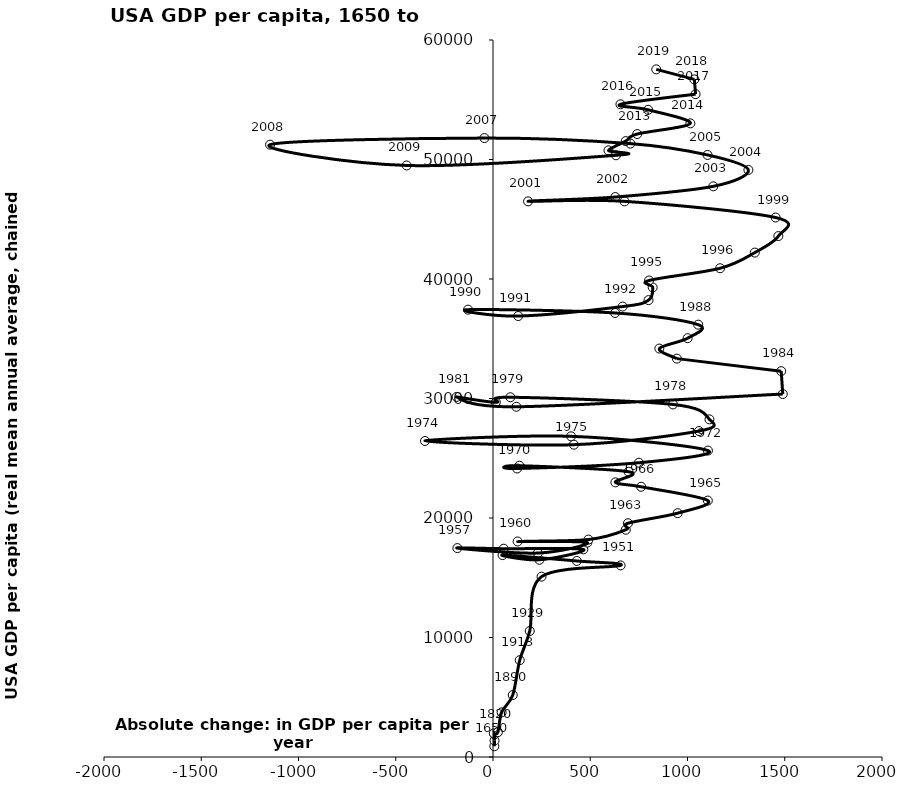
| Category | Series 0 |
|---|---|
| 6.828571428571428 | 897 |
| 7.888 | 1375 |
| 7.5625 | 1883 |
| 4.377777777777778 | 1980 |
| 25.085714285714285 | 2080 |
| 44.34285714285714 | 3736 |
| 101.51162790697674 | 5184 |
| 137.4102564102564 | 8101 |
| 188.9527027027027 | 10543 |
| 249.5340909090909 | 15092.25 |
| 656.125 | 16032.75 |
| 430.75 | 16404.5 |
| 49.25 | 16894.25 |
| 238.5 | 16503 |
| 464.375 | 17371.25 |
| 55.25 | 17431.75 |
| -183.25 | 17481.75 |
| 230.375 | 17065.25 |
| 485.25 | 17942.5 |
| 126.5 | 18035.75 |
| 490.5 | 18195.5 |
| 682.5 | 19016.75 |
| 693.875 | 19560.5 |
| 949.25 | 20404.5 |
| 1104.5 | 21459 |
| 761.625 | 22613.5 |
| 629.25 | 22982.25 |
| 697.25 | 23872 |
| 135.25 | 24376.75 |
| 123.75 | 24142.5 |
| 750.125 | 24624.25 |
| 1105.0 | 25642.75 |
| 401.375 | 26834.25 |
| -349.75 | 26445.5 |
| 416.0 | 26134.75 |
| 1059.25 | 27277.5 |
| 1112.875 | 28253.25 |
| 925.375 | 29503.25 |
| 89.25 | 30104 |
| 14.375 | 29681.75 |
| -186.875 | 30132.75 |
| 120.0 | 29308 |
| 1489.875 | 30372.75 |
| 1481.75 | 32287.75 |
| 945.5 | 33336.25 |
| 855.125 | 34178.75 |
| 1000.625 | 35046.5 |
| 1055.0 | 36180 |
| 627.75 | 37156.5 |
| -128.25 | 37435.5 |
| 129.625 | 36900 |
| 666.5 | 37694.75 |
| 799.625 | 38233 |
| 821.0 | 39294 |
| 802.375 | 39875 |
| 1167.5 | 40898.75 |
| 1346.125 | 42210 |
| 1467.125 | 43591 |
| 1453.125 | 45144.25 |
| 676.375 | 46497.25 |
| 180.375 | 46497 |
| 628.75 | 46858 |
| 1132.75 | 47754.5 |
| 1313.125 | 49123.5 |
| 1103.0 | 50380.75 |
| 706.375 | 51329.5 |
| -44.125 | 51793.5 |
| -1146.25 | 51241.25 |
| -443.875 | 49501 |
| 632.25 | 50353.5 |
| 593.75 | 50765.5 |
| 682.375 | 51541 |
| 741.25 | 52130.25 |
| 1014.75 | 53023.5 |
| 797.5 | 54159.75 |
| 655.25 | 54618.5 |
| 1041.625 | 55470.25 |
| 1035.375 | 56701.75 |
| 839.25 | 57541 |